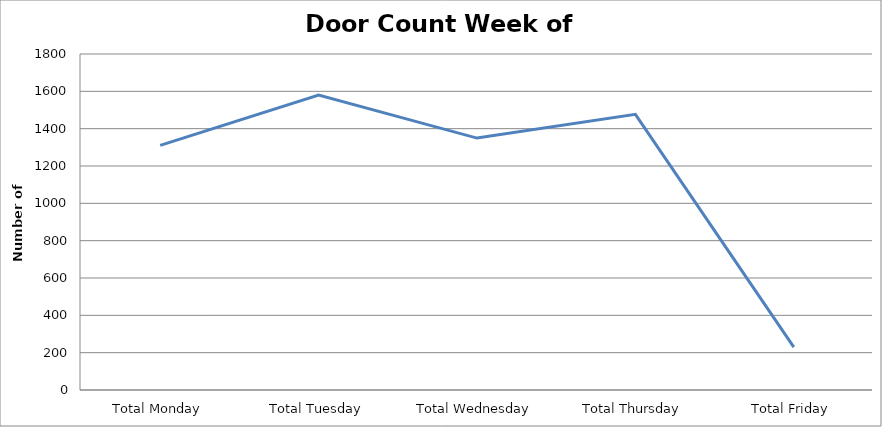
| Category | Series 0 |
|---|---|
| Total Monday | 1310.5 |
| Total Tuesday | 1579.5 |
| Total Wednesday | 1349.5 |
| Total Thursday | 1476.5 |
| Total Friday | 230 |